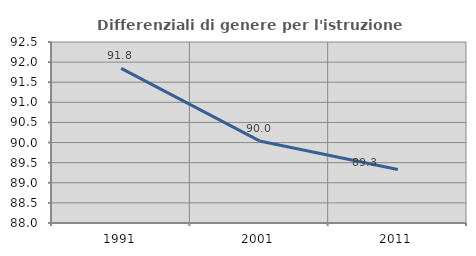
| Category | Differenziali di genere per l'istruzione superiore |
|---|---|
| 1991.0 | 91.845 |
| 2001.0 | 90.04 |
| 2011.0 | 89.329 |